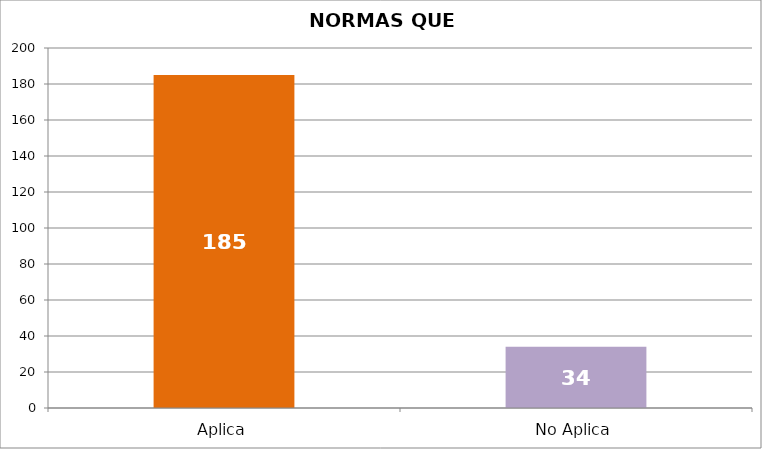
| Category | Series 0 |
|---|---|
| Aplica | 185 |
| No Aplica | 34 |